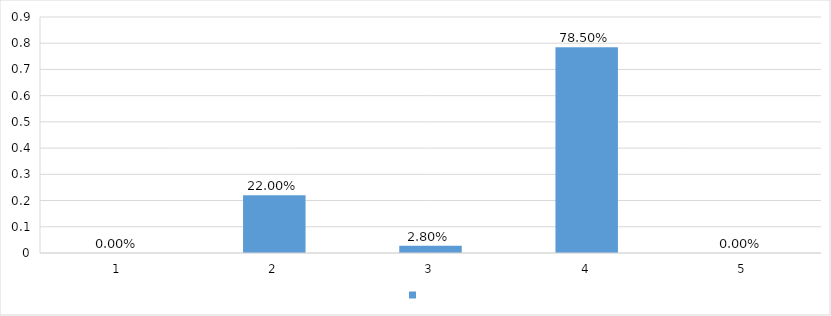
| Category | Series 0 |
|---|---|
| 1 | 0 |
| 2 | 0.22 |
| 3 | 0.028 |
| 4 | 0.785 |
| 5 | 0 |